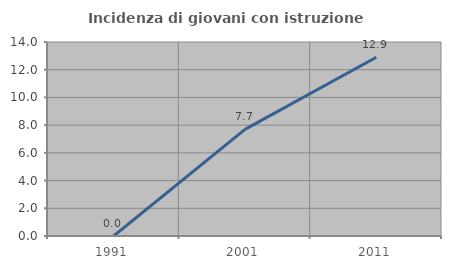
| Category | Incidenza di giovani con istruzione universitaria |
|---|---|
| 1991.0 | 0 |
| 2001.0 | 7.692 |
| 2011.0 | 12.903 |